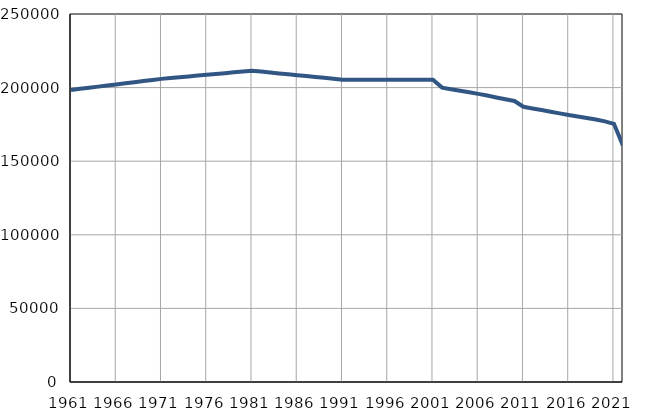
| Category | Број
становника |
|---|---|
| 1961.0 | 198392 |
| 1962.0 | 199146 |
| 1963.0 | 199899 |
| 1964.0 | 200653 |
| 1965.0 | 201407 |
| 1966.0 | 202161 |
| 1967.0 | 202914 |
| 1968.0 | 203668 |
| 1969.0 | 204422 |
| 1970.0 | 205175 |
| 1971.0 | 205929 |
| 1972.0 | 206484 |
| 1973.0 | 207038 |
| 1974.0 | 207593 |
| 1975.0 | 208147 |
| 1976.0 | 208702 |
| 1977.0 | 209257 |
| 1978.0 | 209811 |
| 1979.0 | 210366 |
| 1980.0 | 210920 |
| 1981.0 | 211475 |
| 1982.0 | 210868 |
| 1983.0 | 210260 |
| 1984.0 | 209653 |
| 1985.0 | 209045 |
| 1986.0 | 208438 |
| 1987.0 | 207831 |
| 1988.0 | 207223 |
| 1989.0 | 206616 |
| 1990.0 | 206008 |
| 1991.0 | 205401 |
| 1992.0 | 205390 |
| 1993.0 | 205379 |
| 1994.0 | 205368 |
| 1995.0 | 205357 |
| 1996.0 | 205346 |
| 1997.0 | 205334 |
| 1998.0 | 205323 |
| 1999.0 | 205312 |
| 2000.0 | 205301 |
| 2001.0 | 205290 |
| 2002.0 | 199999 |
| 2003.0 | 198926 |
| 2004.0 | 197919 |
| 2005.0 | 196843 |
| 2006.0 | 195731 |
| 2007.0 | 194573 |
| 2008.0 | 193329 |
| 2009.0 | 192118 |
| 2010.0 | 190919 |
| 2011.0 | 186985 |
| 2012.0 | 185822 |
| 2013.0 | 184756 |
| 2014.0 | 183622 |
| 2015.0 | 182470 |
| 2016.0 | 181334 |
| 2017.0 | 180349 |
| 2018.0 | 179380 |
| 2019.0 | 178294 |
| 2020.0 | 177044 |
| 2021.0 | 175397 |
| 2022.0 | 160506 |